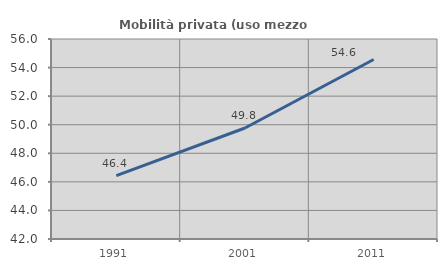
| Category | Mobilità privata (uso mezzo privato) |
|---|---|
| 1991.0 | 46.442 |
| 2001.0 | 49.769 |
| 2011.0 | 54.567 |